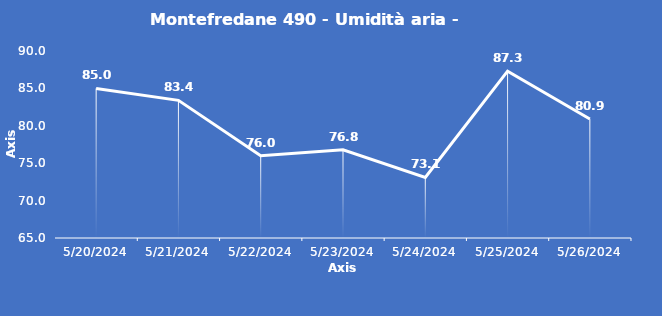
| Category | Montefredane 490 - Umidità aria - Grezzo (%) |
|---|---|
| 5/20/24 | 85 |
| 5/21/24 | 83.4 |
| 5/22/24 | 76 |
| 5/23/24 | 76.8 |
| 5/24/24 | 73.1 |
| 5/25/24 | 87.3 |
| 5/26/24 | 80.9 |